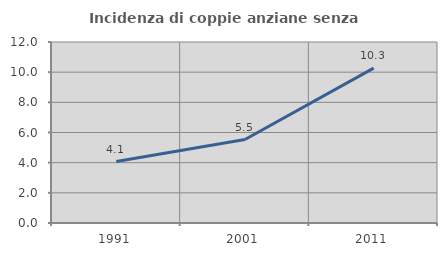
| Category | Incidenza di coppie anziane senza figli  |
|---|---|
| 1991.0 | 4.077 |
| 2001.0 | 5.532 |
| 2011.0 | 10.271 |